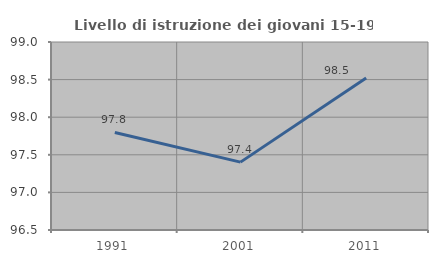
| Category | Livello di istruzione dei giovani 15-19 anni |
|---|---|
| 1991.0 | 97.797 |
| 2001.0 | 97.403 |
| 2011.0 | 98.522 |